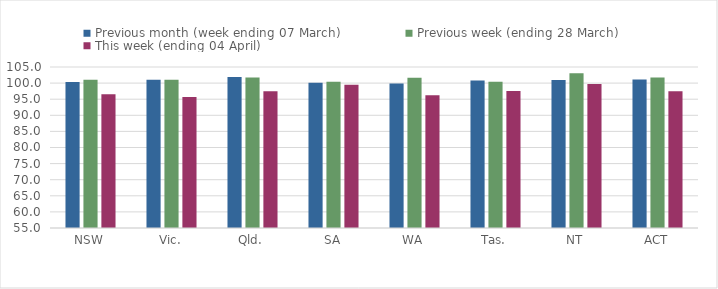
| Category | Previous month (week ending 07 March) | Previous week (ending 28 March) | This week (ending 04 April) |
|---|---|---|---|
| NSW | 100.337 | 101.069 | 96.534 |
| Vic. | 101.04 | 101.03 | 95.691 |
| Qld. | 101.917 | 101.777 | 97.456 |
| SA | 100.105 | 100.394 | 99.478 |
| WA | 99.841 | 101.662 | 96.21 |
| Tas. | 100.836 | 100.458 | 97.522 |
| NT | 100.946 | 103.095 | 99.713 |
| ACT | 101.081 | 101.754 | 97.502 |